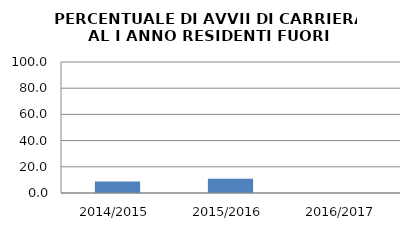
| Category | 2014/2015 2015/2016 2016/2017 |
|---|---|
| 2014/2015 | 8.824 |
| 2015/2016 | 10.811 |
| 2016/2017 | 0 |